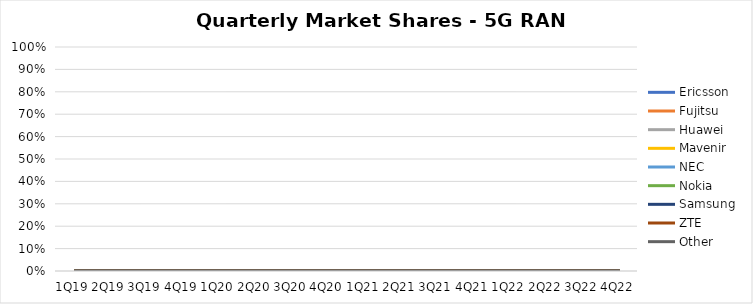
| Category | Ericsson | Fujitsu | Huawei | Mavenir | NEC | Nokia | Samsung | ZTE | Other |
|---|---|---|---|---|---|---|---|---|---|
| 1Q19 | 0 | 0 | 0 | 0 | 0 | 0 | 0 | 0 | 0 |
| 2Q19 | 0 | 0 | 0 | 0 | 0 | 0 | 0 | 0 | 0 |
| 3Q19 | 0 | 0 | 0 | 0 | 0 | 0 | 0 | 0 | 0 |
| 4Q19 | 0 | 0 | 0 | 0 | 0 | 0 | 0 | 0 | 0 |
| 1Q20 | 0 | 0 | 0 | 0 | 0 | 0 | 0 | 0 | 0 |
| 2Q20 | 0 | 0 | 0 | 0 | 0 | 0 | 0 | 0 | 0 |
| 3Q20 | 0 | 0 | 0 | 0 | 0 | 0 | 0 | 0 | 0 |
| 4Q20 | 0 | 0 | 0 | 0 | 0 | 0 | 0 | 0 | 0 |
| 1Q21 | 0 | 0 | 0 | 0 | 0 | 0 | 0 | 0 | 0 |
| 2Q21 | 0 | 0 | 0 | 0 | 0 | 0 | 0 | 0 | 0 |
| 3Q21 | 0 | 0 | 0 | 0 | 0 | 0 | 0 | 0 | 0 |
| 4Q21 | 0 | 0 | 0 | 0 | 0 | 0 | 0 | 0 | 0 |
| 1Q22 | 0 | 0 | 0 | 0 | 0 | 0 | 0 | 0 | 0 |
| 2Q22 | 0 | 0 | 0 | 0 | 0 | 0 | 0 | 0 | 0 |
| 3Q22 | 0 | 0 | 0 | 0 | 0 | 0 | 0 | 0 | 0 |
| 4Q22 | 0 | 0 | 0 | 0 | 0 | 0 | 0 | 0 | 0 |